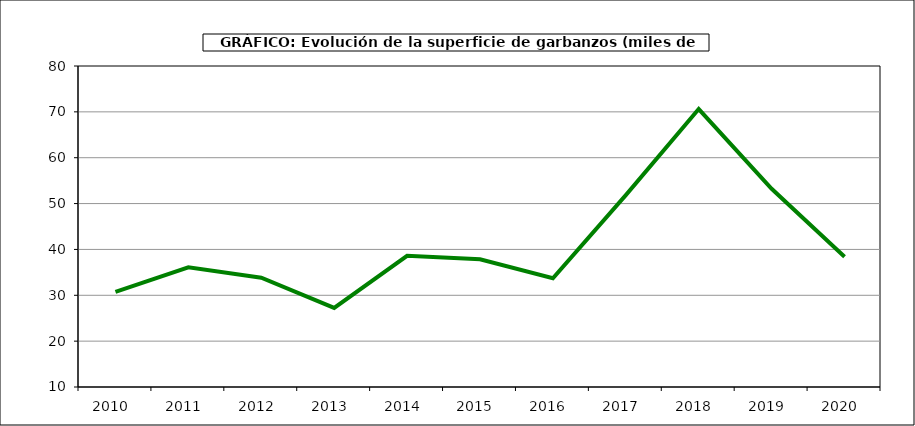
| Category | Superficie |
|---|---|
| 2010.0 | 30.725 |
| 2011.0 | 36.097 |
| 2012.0 | 33.84 |
| 2013.0 | 27.252 |
| 2014.0 | 38.61 |
| 2015.0 | 37.869 |
| 2016.0 | 33.708 |
| 2017.0 | 51.856 |
| 2018.0 | 70.609 |
| 2019.0 | 53.224 |
| 2020.0 | 38.413 |